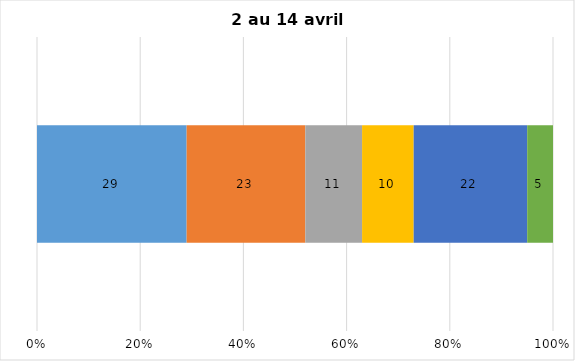
| Category | Plusieurs fois par jour | Une fois par jour | Quelques fois par semaine   | Une fois par semaine ou moins   |  Jamais   |  Je n’utilise pas les médias sociaux |
|---|---|---|---|---|---|---|
| 0 | 29 | 23 | 11 | 10 | 22 | 5 |